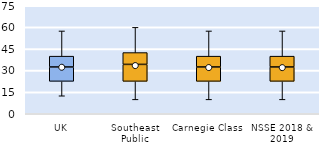
| Category | 25th | 50th | 75th |
|---|---|---|---|
| UK | 22.5 | 10 | 7.5 |
| Southeast Public | 22.5 | 11.786 | 8.214 |
| Carnegie Class | 22.5 | 10 | 7.5 |
| NSSE 2018 & 2019 | 22.5 | 10 | 7.5 |